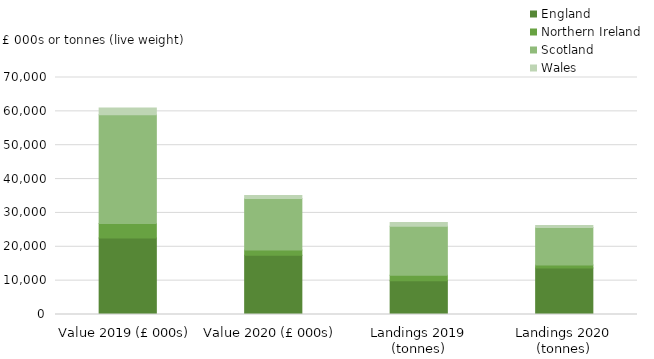
| Category | England | Northern Ireland | Scotland | Wales |
|---|---|---|---|---|
| 0 | 22630.521 | 4224.322 | 32158.437 | 1952.261 |
| 1 | 17485.143 | 1587.921 | 15200.645 | 854.071 |
| 2 | 9949.059 | 1626.214 | 14521.857 | 1042.643 |
| 3 | 13751.065 | 869.238 | 11109.996 | 546.025 |